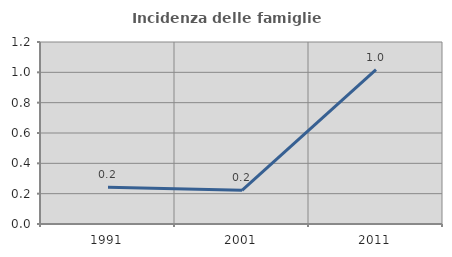
| Category | Incidenza delle famiglie numerose |
|---|---|
| 1991.0 | 0.243 |
| 2001.0 | 0.222 |
| 2011.0 | 1.018 |